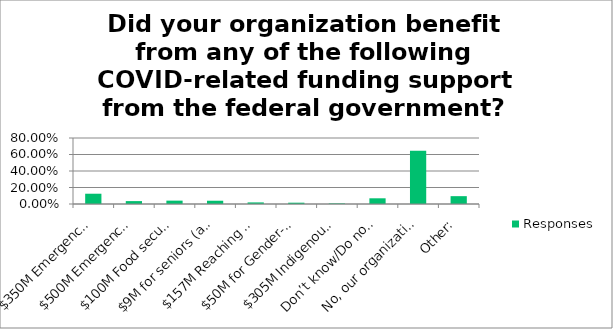
| Category | Responses |
|---|---|
| $350M Emergency support fund for nonprofits and charities (allocated through Red Cross, Community Foundations of Canada and the United Ways of Canada) | 0.125 |
| $500M Emergency support fund for arts, culture and sport organizations | 0.035 |
| $100M Food security to improve food security for people, including Indigenous peoples and Northern populations | 0.041 |
| $9M for seniors (allocated through United Way Centraide Canada) | 0.04 |
| $157M Reaching Home initiative for people experiencing homelessness | 0.019 |
| $50M for Gender-based violence | 0.016 |
| $305M Indigenous Community Support Fund (allocated through Friendship Centres) | 0.007 |
| Don’t know/Do not wish to say | 0.069 |
| No, our organization did not benefit from any of these. | 0.644 |
| Other: | 0.095 |